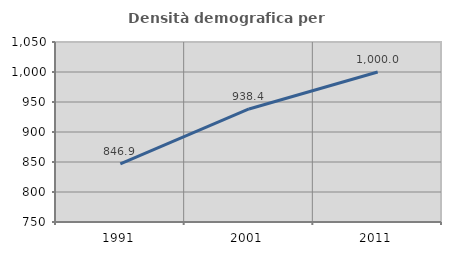
| Category | Densità demografica |
|---|---|
| 1991.0 | 846.875 |
| 2001.0 | 938.393 |
| 2011.0 | 999.984 |